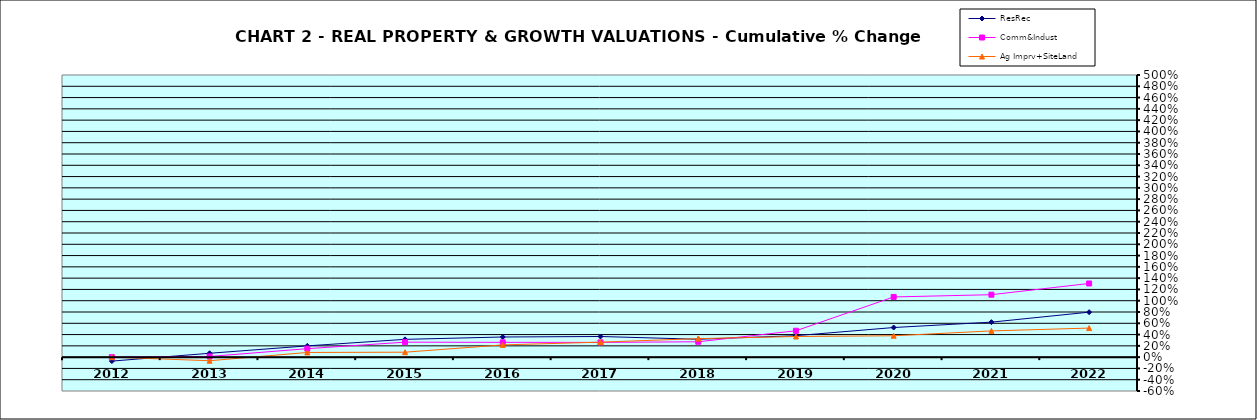
| Category | ResRec | Comm&Indust | Ag Imprv+SiteLand |
|---|---|---|---|
| 2012.0 | -0.07 | 0 | 0 |
| 2013.0 | 0.069 | 0.012 | -0.064 |
| 2014.0 | 0.2 | 0.15 | 0.083 |
| 2015.0 | 0.315 | 0.265 | 0.088 |
| 2016.0 | 0.357 | 0.262 | 0.217 |
| 2017.0 | 0.366 | 0.261 | 0.266 |
| 2018.0 | 0.317 | 0.272 | 0.328 |
| 2019.0 | 0.38 | 0.468 | 0.366 |
| 2020.0 | 0.525 | 1.067 | 0.379 |
| 2021.0 | 0.62 | 1.107 | 0.465 |
| 2022.0 | 0.797 | 1.305 | 0.515 |